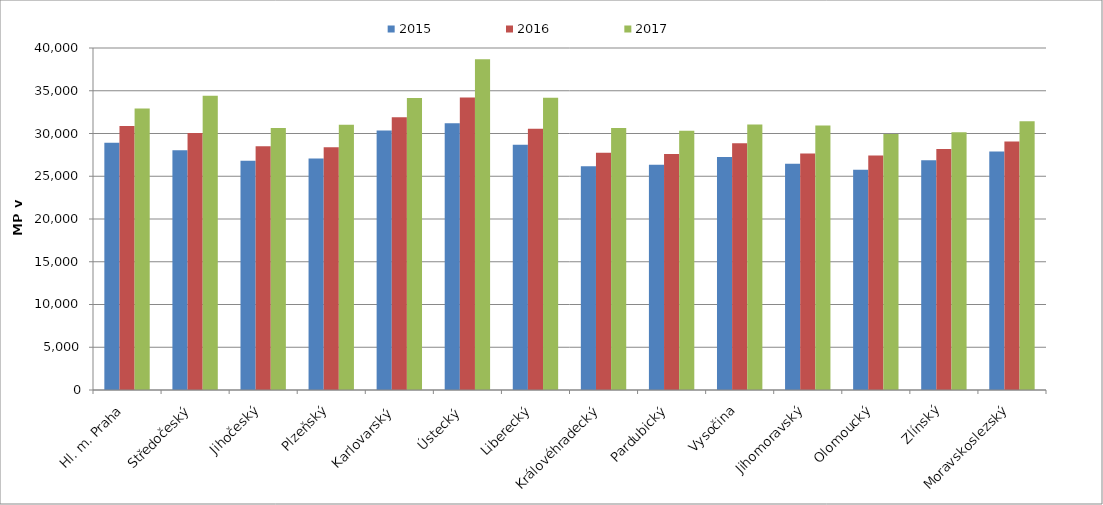
| Category | 2015 | 2016 | 2017 |
|---|---|---|---|
| Hl. m. Praha | 28911.065 | 30874.997 | 32919.015 |
| Středočeský | 28052.282 | 30068.637 | 34404.675 |
| Jihočeský | 26815.395 | 28505.301 | 30641.721 |
| Plzeňský | 27073.601 | 28388.842 | 31037.55 |
| Karlovarský  | 30339.535 | 31914.322 | 34166.021 |
| Ústecký   | 31209.935 | 34216.98 | 38698.261 |
| Liberecký | 28693.703 | 30562.566 | 34185.996 |
| Královéhradecký | 26169.594 | 27755.535 | 30654.581 |
| Pardubický | 26341.388 | 27605.231 | 30318.112 |
| Vysočina | 27250.376 | 28869.156 | 31047.771 |
| Jihomoravský | 26455.193 | 27654.6 | 30921.908 |
| Olomoucký | 25760.458 | 27412.923 | 29927.016 |
| Zlínský | 26877.857 | 28191.048 | 30158.295 |
| Moravskoslezský | 27897.305 | 29059.144 | 31425.86 |